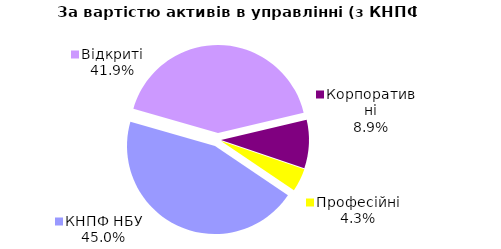
| Category | Series 0 |
|---|---|
| Відкриті | 1518.668 |
| Корпоративні | 322.906 |
| Професійні | 154.367 |
| КНПФ НБУ | 1632.314 |